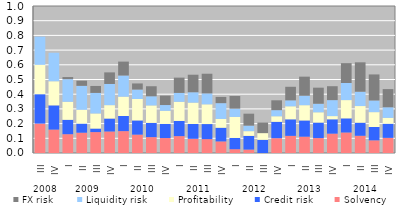
| Category | Solvency | Credit risk | Profitability | Liquidity risk | FX risk |
|---|---|---|---|---|---|
| 0 | 0.2 | 0.2 | 0.2 | 0.192 | 0 |
| 1 | 0.159 | 0.165 | 0.164 | 0.194 | 0 |
| 2 | 0.128 | 0.098 | 0.123 | 0.153 | 0.014 |
| 3 | 0.138 | 0.062 | 0.094 | 0.163 | 0.035 |
| 4 | 0.142 | 0.024 | 0.103 | 0.14 | 0.047 |
| 5 | 0.146 | 0.088 | 0.091 | 0.144 | 0.079 |
| 6 | 0.149 | 0.103 | 0.132 | 0.144 | 0.095 |
| 7 | 0.125 | 0.097 | 0.146 | 0.064 | 0.042 |
| 8 | 0.108 | 0.097 | 0.119 | 0.062 | 0.068 |
| 9 | 0.102 | 0.096 | 0.089 | 0.039 | 0.064 |
| 10 | 0.115 | 0.103 | 0.13 | 0.06 | 0.104 |
| 11 | 0.097 | 0.101 | 0.146 | 0.07 | 0.119 |
| 12 | 0.094 | 0.103 | 0.134 | 0.074 | 0.134 |
| 13 | 0.079 | 0.093 | 0.06 | 0.107 | 0.042 |
| 14 | 0.026 | 0.077 | 0.143 | 0.056 | 0.086 |
| 15 | 0.023 | 0.093 | 0.032 | 0.038 | 0.081 |
| 16 | 0 | 0.09 | 0.045 | 0 | 0.072 |
| 17 | 0.101 | 0.111 | 0.038 | 0.041 | 0.067 |
| 18 | 0.117 | 0.113 | 0.089 | 0.04 | 0.092 |
| 19 | 0.111 | 0.11 | 0.104 | 0.065 | 0.129 |
| 20 | 0.102 | 0.105 | 0.07 | 0.058 | 0.109 |
| 21 | 0.132 | 0.098 | 0.022 | 0.109 | 0.095 |
| 22 | 0.139 | 0.096 | 0.124 | 0.116 | 0.135 |
| 23 | 0.117 | 0.089 | 0.113 | 0.097 | 0.2 |
| 24 | 0.086 | 0.091 | 0.101 | 0.079 | 0.177 |
| 25 | 0.103 | 0.096 | 0.04 | 0.072 | 0.124 |